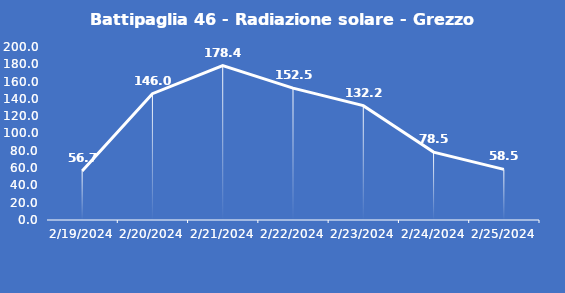
| Category | Battipaglia 46 - Radiazione solare - Grezzo (W/m2) |
|---|---|
| 2/19/24 | 56.7 |
| 2/20/24 | 146 |
| 2/21/24 | 178.4 |
| 2/22/24 | 152.5 |
| 2/23/24 | 132.2 |
| 2/24/24 | 78.5 |
| 2/25/24 | 58.5 |